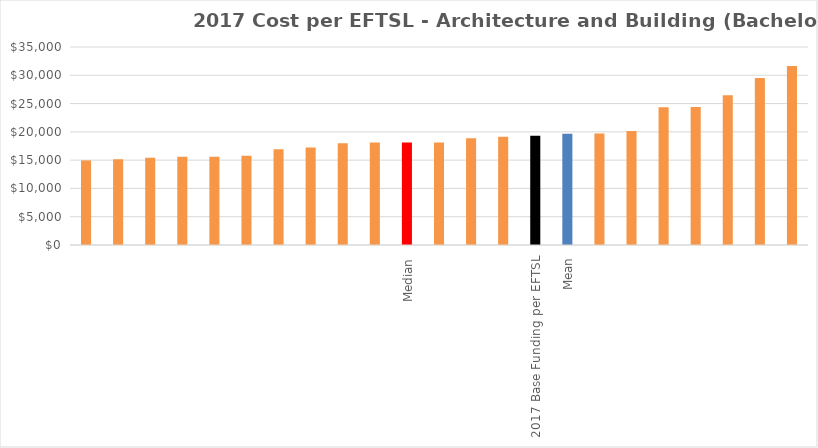
| Category | Series 0 |
|---|---|
|  | 14951.491 |
|  | 15160.946 |
|  | 15439.581 |
|  | 15595.599 |
|  | 15617.454 |
|  | 15775.55 |
|  | 16928.157 |
|  | 17225.582 |
|  | 18002.343 |
|  | 18101.301 |
| Median | 18104.072 |
|  | 18106.844 |
|  | 18876.869 |
|  | 19129.908 |
| 2017 Base Funding per EFTSL | 19328 |
| Mean | 19679 |